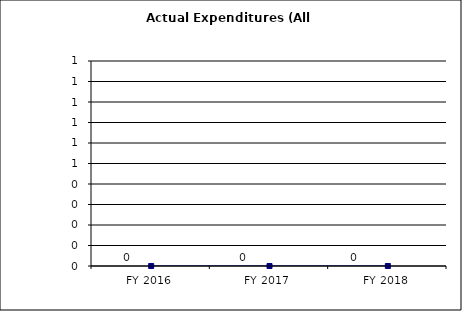
| Category | Actual Expenditures (All Funds) |
|---|---|
| FY 2016 | 0 |
| FY 2017 | 0 |
| FY 2018 | 0 |